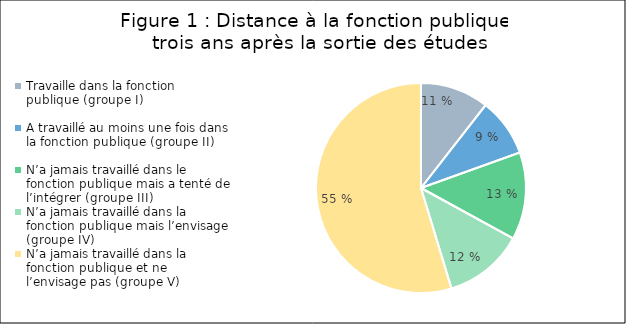
| Category | Series 0 |
|---|---|
| Travaille dans la fonction publique (groupe I) | 0.105 |
| A travaillé au moins une fois dans la fonction publique (groupe II) | 0.09 |
| N’a jamais travaillé dans le fonction publique mais a tenté de l’intégrer (groupe III) | 0.135 |
| N’a jamais travaillé dans la fonction publique mais l’envisage (groupe IV) | 0.123 |
| N’a jamais travaillé dans la fonction publique et ne l’envisage pas (groupe V) | 0.547 |